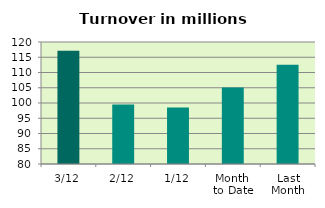
| Category | Series 0 |
|---|---|
| 3/12 | 117.114 |
| 2/12 | 99.524 |
| 1/12 | 98.535 |
| Month 
to Date | 105.057 |
| Last
Month | 112.501 |